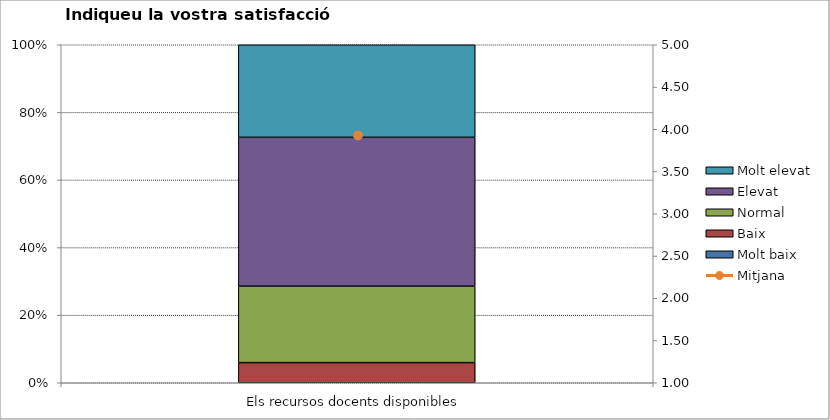
| Category | Molt baix | Baix | Normal  | Elevat | Molt elevat |
|---|---|---|---|---|---|
| Els recursos docents disponibles | 0 | 5 | 19 | 37 | 23 |